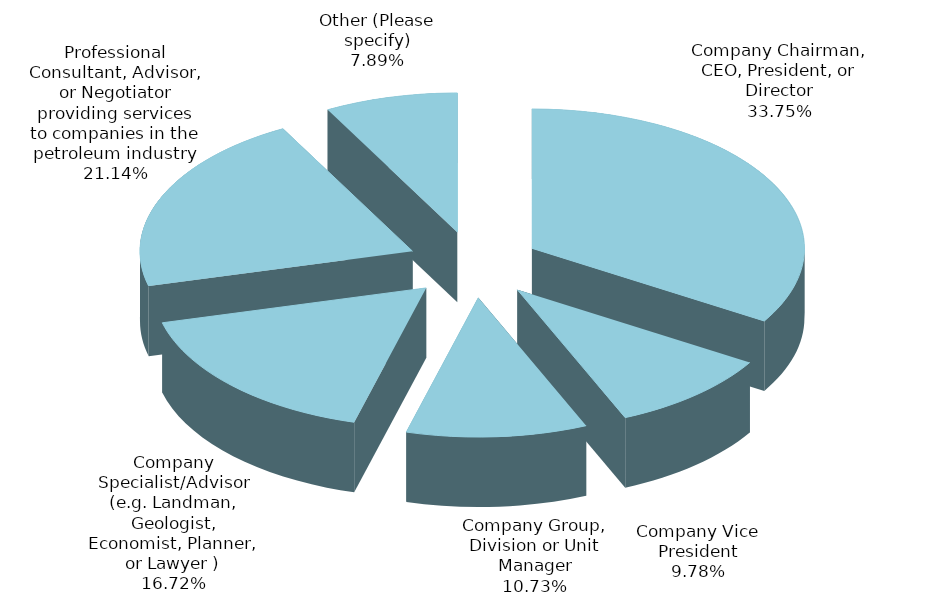
| Category | Series 0 |
|---|---|
| Company Chairman, CEO, President, or Director | 0.338 |
| Company Vice President | 0.098 |
| Company Group, Division or Unit Manager | 0.107 |
| Company Specialist/Advisor (e.g. Landman, Geologist, Economist, Planner, or Lawyer ) | 0.167 |
| Professional Consultant, Advisor, or Negotiator providing services to companies in the petroleum industry | 0.211 |
| Other (Please specify) | 0.079 |